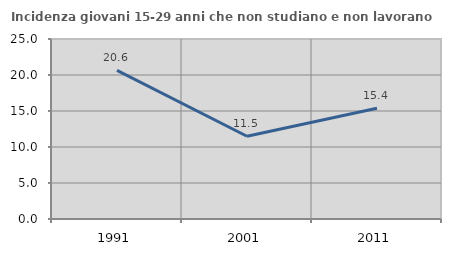
| Category | Incidenza giovani 15-29 anni che non studiano e non lavorano  |
|---|---|
| 1991.0 | 20.637 |
| 2001.0 | 11.488 |
| 2011.0 | 15.385 |